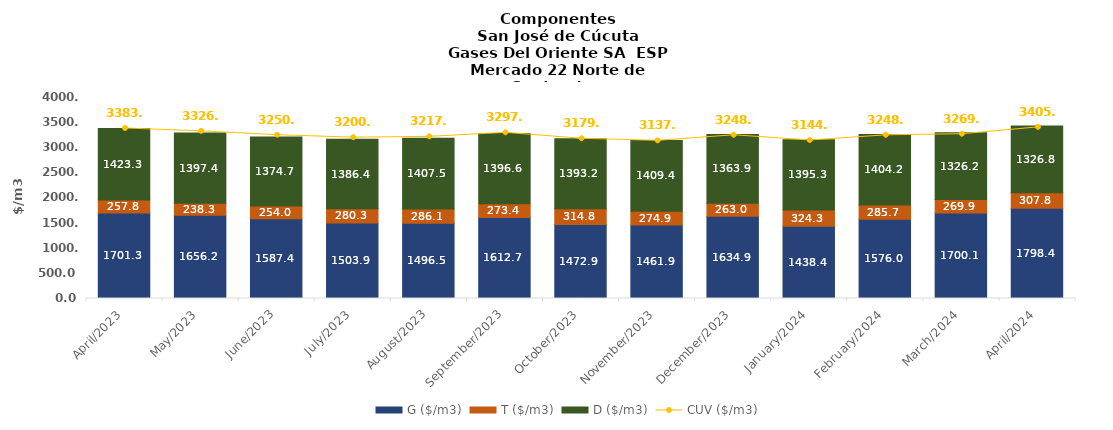
| Category | G ($/m3) | T ($/m3) | D ($/m3) |
|---|---|---|---|
| 2023-04-01 | 1701.33 | 257.81 | 1423.3 |
| 2023-05-01 | 1656.2 | 238.29 | 1397.37 |
| 2023-06-01 | 1587.41 | 254 | 1374.66 |
| 2023-07-01 | 1503.89 | 280.27 | 1386.35 |
| 2023-08-01 | 1496.47 | 286.1 | 1407.49 |
| 2023-09-01 | 1612.68 | 273.44 | 1396.57 |
| 2023-10-01 | 1472.87 | 314.83 | 1393.18 |
| 2023-11-01 | 1461.93 | 274.94 | 1409.38 |
| 2023-12-01 | 1634.91 | 262.98 | 1363.86 |
| 2024-01-01 | 1438.39 | 324.32 | 1395.26 |
| 2024-02-01 | 1576.01 | 285.69 | 1404.22 |
| 2024-03-01 | 1700.05 | 269.94 | 1326.24 |
| 2024-04-01 | 1798.37 | 307.79 | 1326.82 |